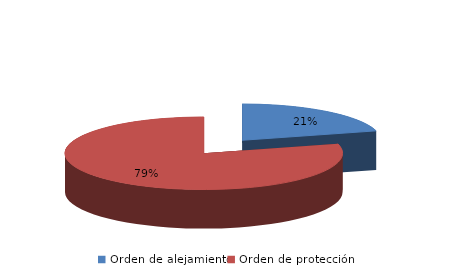
| Category | Series 0 |
|---|---|
| Orden de alejamiento | 87 |
| Orden de protección | 331 |